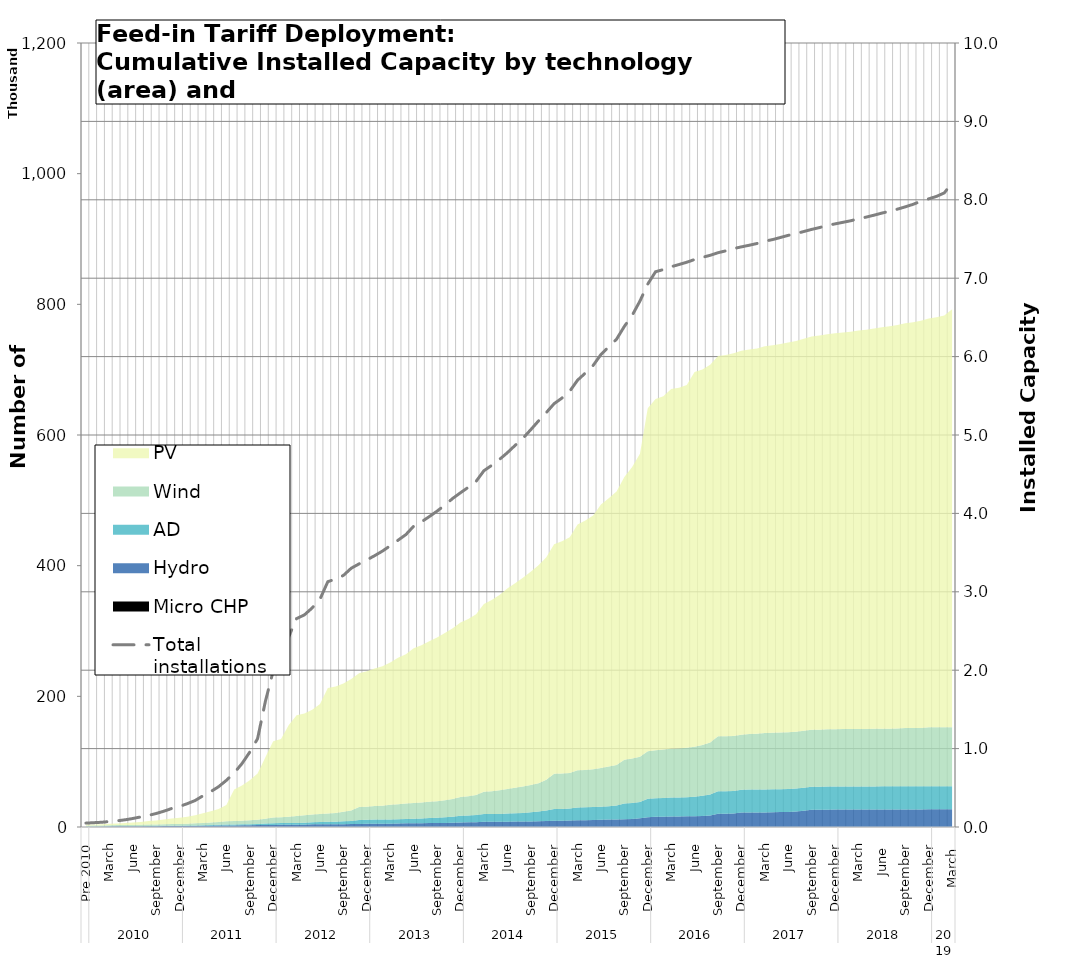
| Category | Total installations |
|---|---|
| 0 | 5948 |
| 1 | 6609 |
| 2 | 7234 |
| 3 | 8333 |
| 4 | 9422 |
| 5 | 10993 |
| 6 | 12972 |
| 7 | 15360 |
| 8 | 17705 |
| 9 | 20643 |
| 10 | 24229 |
| 11 | 28356 |
| 12 | 31516 |
| 13 | 35754 |
| 14 | 40538 |
| 15 | 47748 |
| 16 | 54195 |
| 17 | 61655 |
| 18 | 71419 |
| 19 | 82779 |
| 20 | 97041 |
| 21 | 114620 |
| 22 | 135217 |
| 23 | 192351 |
| 24 | 238669 |
| 25 | 247284 |
| 26 | 291456 |
| 27 | 319030 |
| 28 | 324661 |
| 29 | 335339 |
| 30 | 348787 |
| 31 | 375498 |
| 32 | 379585 |
| 33 | 385087 |
| 34 | 396079 |
| 35 | 402677 |
| 36 | 408791 |
| 37 | 415288 |
| 38 | 422321 |
| 39 | 430463 |
| 40 | 438938 |
| 41 | 447541 |
| 42 | 460311 |
| 43 | 467119 |
| 44 | 475026 |
| 45 | 483483 |
| 46 | 492540 |
| 47 | 502890 |
| 48 | 511593 |
| 49 | 519920 |
| 50 | 529036 |
| 51 | 545283 |
| 52 | 553540 |
| 53 | 562621 |
| 54 | 572797 |
| 55 | 584103 |
| 56 | 594965 |
| 57 | 608015 |
| 58 | 621543 |
| 59 | 634365 |
| 60 | 647930 |
| 61 | 656474 |
| 62 | 666987 |
| 63 | 683826 |
| 64 | 694793 |
| 65 | 706405 |
| 66 | 723199 |
| 67 | 734938 |
| 68 | 746641 |
| 69 | 766216 |
| 70 | 783051 |
| 71 | 805053 |
| 72 | 831033 |
| 73 | 849891 |
| 74 | 853223 |
| 75 | 857543 |
| 76 | 860928 |
| 77 | 864443 |
| 78 | 868602 |
| 79 | 871907 |
| 80 | 875062 |
| 81 | 879023 |
| 82 | 881871 |
| 83 | 885340 |
| 84 | 887959 |
| 85 | 890435 |
| 86 | 893124 |
| 87 | 896674 |
| 88 | 899094 |
| 89 | 902316 |
| 90 | 905572 |
| 91 | 908267 |
| 92 | 911463 |
| 93 | 914692 |
| 94 | 917471 |
| 95 | 920829 |
| 96 | 923111 |
| 97 | 925525 |
| 98 | 927866 |
| 99 | 930967 |
| 100 | 933541 |
| 101 | 936478 |
| 102 | 939660 |
| 103 | 942419 |
| 104 | 945684 |
| 105 | 949212 |
| 106 | 953075 |
| 107 | 957777 |
| 108 | 961474 |
| 109 | 965203 |
| 110 | 970563 |
| 111 | 985700 |